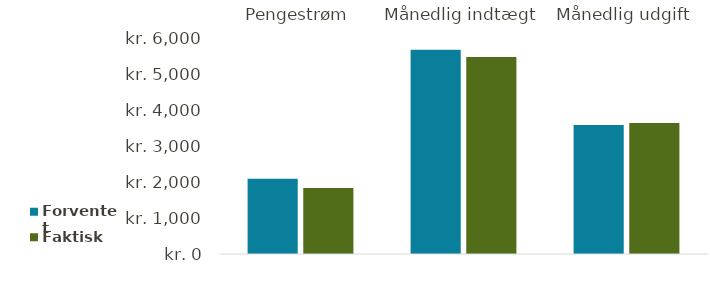
| Category | Forventet | Faktisk |
|---|---|---|
| Pengestrøm | 2097 | 1845 |
| Månedlig indtægt | 5700 | 5500 |
| Månedlig udgift | 3603 | 3655 |